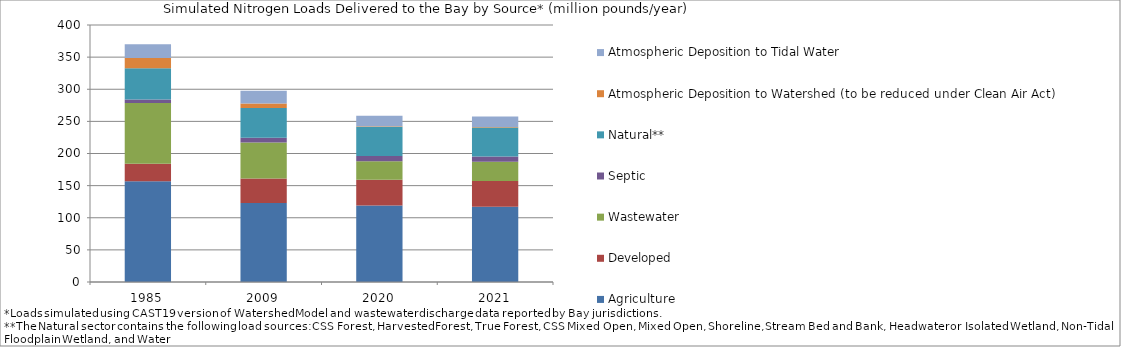
| Category | Agriculture | Developed | Wastewater | Septic | Natural** | Atmospheric Deposition to Watershed (to be reduced under Clean Air Act) | Atmospheric Deposition to Tidal Water |
|---|---|---|---|---|---|---|---|
| 1985.0 | 156.829 | 27.383 | 94.543 | 5.451 | 48.507 | 15.901 | 21.521 |
| 2009.0 | 123.022 | 37.952 | 56.087 | 7.562 | 46.191 | 7.184 | 19.804 |
| 2020.0 | 119.106 | 39.874 | 29.096 | 7.843 | 45.551 | 1.104 | 16.341 |
| 2021.0 | 117.059 | 40.269 | 29.969 | 7.845 | 45.311 | 0.882 | 16.19 |